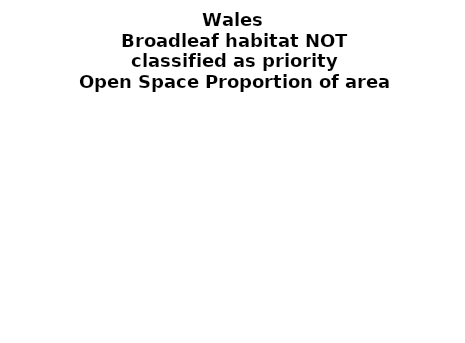
| Category | Broadleaf habitat NOT classified as priority |
|---|---|
|  ≥ 10ha, < 10%  | 0.359 |
|   ≥ 10ha, 10-25% | 0.079 |
|   ≥ 10ha, > 25 and <50%  | 0.115 |
|   ≥ 10ha, ≥ 50%  | 0.153 |
|  < 10ha, < 10% | 0.02 |
|  < 10ha, 10-25% | 0.016 |
|  < 10ha, > 25 and < 50% | 0.053 |
|  < 10ha, ≥ 50% | 0.205 |